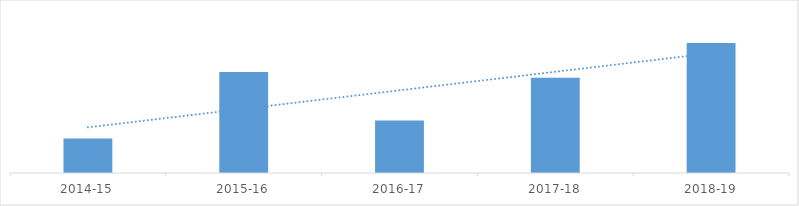
| Category | Series 0 |
|---|---|
| 2014-15 | 0.064 |
| 2015-16 | 0.186 |
| 2016-17 | 0.096 |
| 2017-18 | 0.175 |
| 2018-19 | 0.239 |